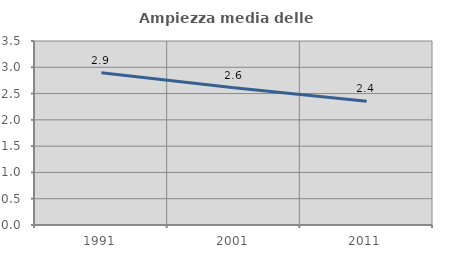
| Category | Ampiezza media delle famiglie |
|---|---|
| 1991.0 | 2.895 |
| 2001.0 | 2.611 |
| 2011.0 | 2.352 |